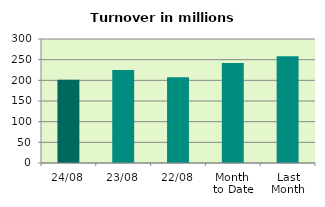
| Category | Series 0 |
|---|---|
| 24/08 | 201.24 |
| 23/08 | 225.204 |
| 22/08 | 207.742 |
| Month 
to Date | 241.764 |
| Last
Month | 258.125 |